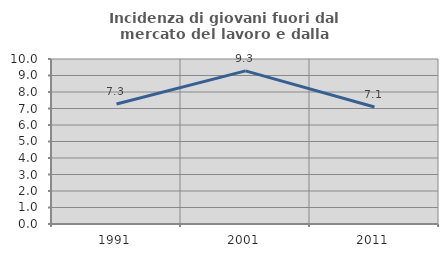
| Category | Incidenza di giovani fuori dal mercato del lavoro e dalla formazione  |
|---|---|
| 1991.0 | 7.276 |
| 2001.0 | 9.28 |
| 2011.0 | 7.094 |